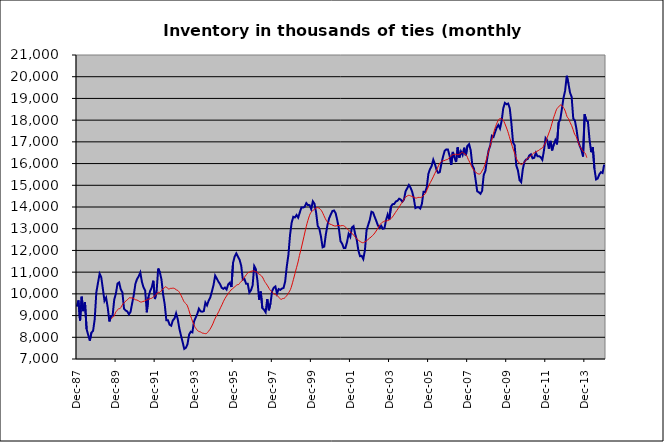
| Category | Series 0 |
|---|---|
| 1983-12-01 | 9414 |
| 1984-01-01 | 9699 |
| 1984-02-01 | 8775 |
| 1984-03-01 | 9870 |
| 1984-04-01 | 9205 |
| 1984-05-01 | 9619 |
| 1984-06-01 | 8382 |
| 1984-07-01 | 8104 |
| 1984-08-01 | 7848 |
| 1984-09-01 | 8218 |
| 1984-10-01 | 8300 |
| 1984-11-01 | 8832 |
| 1984-12-01 | 10074 |
| 1985-01-01 | 10504 |
| 1985-02-01 | 10927 |
| 1985-03-01 | 10771 |
| 1985-04-01 | 10235 |
| 1985-05-01 | 9680 |
| 1985-06-01 | 9826 |
| 1985-07-01 | 9371 |
| 1985-08-01 | 8732 |
| 1985-09-01 | 8966 |
| 1985-10-01 | 9005 |
| 1985-11-01 | 9740 |
| 1985-12-01 | 10008 |
| 1986-01-01 | 10474 |
| 1986-02-01 | 10527 |
| 1986-03-01 | 10205 |
| 1986-04-01 | 10070 |
| 1986-05-01 | 9316 |
| 1986-06-01 | 9234 |
| 1986-07-01 | 9191 |
| 1986-08-01 | 9057 |
| 1986-09-01 | 9167 |
| 1986-10-01 | 9571 |
| 1986-11-01 | 9949 |
| 1986-12-01 | 10463 |
| 1987-01-01 | 10681 |
| 1987-02-01 | 10803 |
| 1987-03-01 | 10982 |
| 1987-04-01 | 10551 |
| 1987-05-01 | 10294 |
| 1987-06-01 | 10156 |
| 1987-07-01 | 9151 |
| 1987-08-01 | 9852 |
| 1987-09-01 | 10122 |
| 1987-10-01 | 10286 |
| 1987-11-01 | 10604 |
| 1987-12-01 | 9760 |
| 1988-01-01 | 10097 |
| 1988-02-01 | 11165 |
| 1988-03-01 | 10997 |
| 1988-04-01 | 10666 |
| 1988-05-01 | 9979 |
| 1988-06-01 | 9520 |
| 1988-07-01 | 8785 |
| 1988-08-01 | 8787 |
| 1988-09-01 | 8580 |
| 1988-10-01 | 8533 |
| 1988-11-01 | 8780 |
| 1988-12-01 | 8862 |
| 1989-01-01 | 9106 |
| 1989-02-01 | 8840 |
| 1989-03-01 | 8402 |
| 1989-04-01 | 8081 |
| 1989-05-01 | 7779 |
| 1989-06-01 | 7465 |
| 1989-07-01 | 7514 |
| 1989-08-01 | 7680 |
| 1989-09-01 | 8127 |
| 1989-10-01 | 8258 |
| 1989-11-01 | 8226 |
| 1989-12-01 | 8729 |
| 1990-01-01 | 8901 |
| 1990-02-01 | 9072 |
| 1990-03-01 | 9317 |
| 1990-04-01 | 9197 |
| 1990-05-01 | 9178 |
| 1990-06-01 | 9202 |
| 1990-07-01 | 9599 |
| 1990-08-01 | 9469 |
| 1990-09-01 | 9688 |
| 1990-10-01 | 9834 |
| 1990-11-01 | 10112 |
| 1990-12-01 | 10409 |
| 1991-01-01 | 10839 |
| 1991-02-01 | 10708 |
| 1991-03-01 | 10559 |
| 1991-04-01 | 10446 |
| 1991-05-01 | 10281 |
| 1991-06-01 | 10231 |
| 1991-07-01 | 10289 |
| 1991-08-01 | 10200 |
| 1991-09-01 | 10433 |
| 1991-10-01 | 10511 |
| 1991-11-01 | 10314 |
| 1991-12-01 | 11435 |
| 1992-01-01 | 11722 |
| 1992-02-01 | 11863 |
| 1992-03-01 | 11710 |
| 1992-04-01 | 11572 |
| 1992-05-01 | 11293 |
| 1992-06-01 | 10655 |
| 1992-07-01 | 10682 |
| 1992-08-01 | 10463 |
| 1992-09-01 | 10468 |
| 1992-10-01 | 10058 |
| 1992-11-01 | 10168 |
| 1992-12-01 | 10386 |
| 1993-01-01 | 11281 |
| 1993-02-01 | 11134 |
| 1993-03-01 | 10598 |
| 1993-04-01 | 9733 |
| 1993-05-01 | 10107 |
| 1993-06-01 | 9340 |
| 1993-07-01 | 9274 |
| 1993-08-01 | 9154 |
| 1993-09-01 | 9762 |
| 1993-10-01 | 9245 |
| 1993-11-01 | 9562 |
| 1993-12-01 | 10135 |
| 1994-01-01 | 10283 |
| 1994-02-01 | 10340 |
| 1994-03-01 | 10018 |
| 1994-04-01 | 10220 |
| 1994-05-01 | 10182 |
| 1994-06-01 | 10244 |
| 1994-07-01 | 10273 |
| 1994-08-01 | 10568 |
| 1994-09-01 | 11264 |
| 1994-10-01 | 11798 |
| 1994-11-01 | 12715 |
| 1994-12-01 | 13284 |
| 1995-01-01 | 13549 |
| 1995-02-01 | 13519 |
| 1995-03-01 | 13633 |
| 1995-04-01 | 13511 |
| 1995-05-01 | 13750 |
| 1995-06-01 | 13981 |
| 1995-07-01 | 13972 |
| 1995-08-01 | 14009 |
| 1995-09-01 | 14178 |
| 1995-10-01 | 14089 |
| 1995-11-01 | 14086 |
| 1995-12-01 | 13900 |
| 1996-01-01 | 14263 |
| 1996-02-01 | 14153 |
| 1996-03-01 | 13750 |
| 1996-04-01 | 13129 |
| 1996-05-01 | 13002 |
| 1996-06-01 | 12636 |
| 1996-07-01 | 12143 |
| 1996-08-01 | 12176.8 |
| 1996-09-01 | 12740.4 |
| 1996-10-01 | 13174 |
| 1996-11-01 | 13473 |
| 1996-12-01 | 13648 |
| 1997-01-01 | 13811 |
| 1997-02-01 | 13839 |
| 1997-03-01 | 13719 |
| 1997-04-01 | 13398 |
| 1997-05-01 | 13009 |
| 1997-06-01 | 12427 |
| 1997-07-01 | 12315 |
| 1997-08-01 | 12108 |
| 1997-09-01 | 12114 |
| 1997-10-01 | 12382 |
| 1997-11-01 | 12764 |
| 1997-12-01 | 12624 |
| 1998-01-01 | 13057 |
| 1998-02-01 | 13118 |
| 1998-03-01 | 12760 |
| 1998-04-01 | 12482 |
| 1998-05-01 | 11995.82 |
| 1998-06-01 | 11734.516 |
| 1998-07-01 | 11750.5 |
| 1998-08-01 | 11601.827 |
| 1998-09-01 | 12005.676 |
| 1998-10-01 | 12927.207 |
| 1998-11-01 | 13173.549 |
| 1998-12-01 | 13405.646 |
| 1999-01-01 | 13781.57 |
| 1999-02-01 | 13747.7 |
| 1999-03-01 | 13543.877 |
| 1999-04-01 | 13354.035 |
| 1999-05-01 | 13148.423 |
| 1999-06-01 | 13037.41 |
| 1999-07-01 | 13135.734 |
| 1999-08-01 | 12996.831 |
| 1999-09-01 | 13019.943 |
| 1999-10-01 | 13403.124 |
| 1999-11-01 | 13657.698 |
| 1999-12-01 | 13425.647 |
| 2000-01-01 | 14022.098 |
| 2000-02-01 | 14128.799 |
| 2000-03-01 | 14140.422 |
| 2000-04-01 | 14253.748 |
| 2000-05-01 | 14283.691 |
| 2000-06-01 | 14383.623 |
| 2000-07-01 | 14342.724 |
| 2000-08-01 | 14243.203 |
| 2000-09-01 | 14341.811 |
| 2000-10-01 | 14728.146 |
| 2000-11-01 | 14864.504 |
| 2000-12-01 | 15014.786 |
| 2001-01-01 | 14898.065 |
| 2001-02-01 | 14707.42 |
| 2001-03-01 | 14410.076 |
| 2001-04-01 | 13951.098 |
| 2001-05-01 | 13983.641 |
| 2001-06-01 | 13988.388 |
| 2001-07-01 | 13926.734 |
| 2001-08-01 | 14143.072 |
| 2001-09-01 | 14698.888 |
| 2001-10-01 | 14691.092 |
| 2001-11-01 | 14904.483 |
| 2001-12-01 | 15530.514 |
| 2002-01-01 | 15747.423 |
| 2002-02-01 | 15889.833 |
| 2002-03-01 | 16177.813 |
| 2002-04-01 | 15980.701 |
| 2002-05-01 | 15711.431 |
| 2002-06-01 | 15572.809 |
| 2002-07-01 | 15605.551 |
| 2002-08-01 | 16001.756 |
| 2002-09-01 | 16317.445 |
| 2002-10-01 | 16585.705 |
| 2002-11-01 | 16653.519 |
| 2002-12-01 | 16646.287 |
| 2003-01-01 | 16366.737 |
| 2003-02-01 | 15936.426 |
| 2003-03-01 | 16537.264 |
| 2003-04-01 | 16280.432 |
| 2003-05-01 | 16073.856 |
| 2003-06-01 | 16744.725 |
| 2003-07-01 | 16269.866 |
| 2003-08-01 | 16560.644 |
| 2003-09-01 | 16397.181 |
| 2003-10-01 | 16730.37 |
| 2003-11-01 | 16382.064 |
| 2003-12-01 | 16815.683 |
| 2004-01-01 | 16897.167 |
| 2004-02-01 | 16609.89 |
| 2004-03-01 | 15918.217 |
| 2004-04-01 | 15761.593 |
| 2004-05-01 | 15255.352 |
| 2004-06-01 | 14718.535 |
| 2004-07-01 | 14679.323 |
| 2004-08-01 | 14607.56 |
| 2004-09-01 | 14747.09 |
| 2004-10-01 | 15483.721 |
| 2004-11-01 | 15656.553 |
| 2004-12-01 | 16177.911 |
| 2005-01-01 | 16611.946 |
| 2005-02-01 | 16824.975 |
| 2005-03-01 | 17278.543 |
| 2005-04-01 | 17226.843 |
| 2005-05-01 | 17451.003 |
| 2005-06-01 | 17660.314 |
| 2005-07-01 | 17775.118 |
| 2005-08-01 | 17615.981 |
| 2005-09-01 | 17961.755 |
| 2005-10-01 | 18549.398 |
| 2005-11-01 | 18792.607 |
| 2005-12-01 | 18730.145 |
| 2006-01-01 | 18763.698 |
| 2006-02-01 | 18542.588 |
| 2006-03-01 | 17845.147 |
| 2006-04-01 | 16973.316 |
| 2006-05-01 | 16842.952 |
| 2006-06-01 | 15910.242 |
| 2006-07-01 | 15687.728 |
| 2006-08-01 | 15233.163 |
| 2006-09-01 | 15144.04 |
| 2006-10-01 | 15738.044 |
| 2006-11-01 | 16082.406 |
| 2006-12-01 | 16184.263 |
| 2007-01-01 | 16210.849 |
| 2007-02-01 | 16374.9 |
| 2007-03-01 | 16427.623 |
| 2007-04-01 | 16243.323 |
| 2007-05-01 | 16265.661 |
| 2007-06-01 | 16490.74 |
| 2007-07-01 | 16341.093 |
| 2007-08-01 | 16340.182 |
| 2007-09-01 | 16293.721 |
| 2007-10-01 | 16174.439 |
| 2007-11-01 | 16604.619 |
| 2007-12-01 | 17174.1 |
| 2008-01-01 | 17073.635 |
| 2008-02-01 | 16688.385 |
| 2008-03-01 | 17045.282 |
| 2008-04-01 | 16609.275 |
| 2008-05-01 | 16872.655 |
| 2008-06-01 | 17075.69 |
| 2008-07-01 | 16885.134 |
| 2008-08-01 | 17888.283 |
| 2008-09-01 | 18026.639 |
| 2008-10-01 | 18505.135 |
| 2008-11-01 | 19022.406 |
| 2008-12-01 | 19357 |
| 2009-01-01 | 20042.926 |
| 2009-02-01 | 19706 |
| 2009-03-01 | 19269.488 |
| 2009-04-01 | 19071.685 |
| 2009-05-01 | 18074.13 |
| 2009-06-01 | 17978.003 |
| 2009-07-01 | 17579.497 |
| 2009-08-01 | 17023.982 |
| 2009-09-01 | 16809.111 |
| 2009-10-01 | 16633.924 |
| 2009-11-01 | 16326.449 |
| 2009-12-01 | 18266.751 |
| 2010-01-01 | 17987.459 |
| 2010-02-01 | 17930.527 |
| 2010-03-01 | 17104.504 |
| 2010-04-01 | 16525.456 |
| 2010-05-01 | 16757.127 |
| 2010-06-01 | 15768.938 |
| 2010-07-01 | 15268.79 |
| 2010-08-01 | 15311.16 |
| 2010-09-01 | 15501.446 |
| 2010-10-01 | 15605.256 |
| 2010-11-01 | 15566.561 |
| 2010-12-01 | 15955.088 |